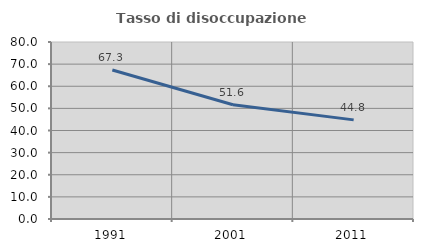
| Category | Tasso di disoccupazione giovanile  |
|---|---|
| 1991.0 | 67.334 |
| 2001.0 | 51.623 |
| 2011.0 | 44.805 |